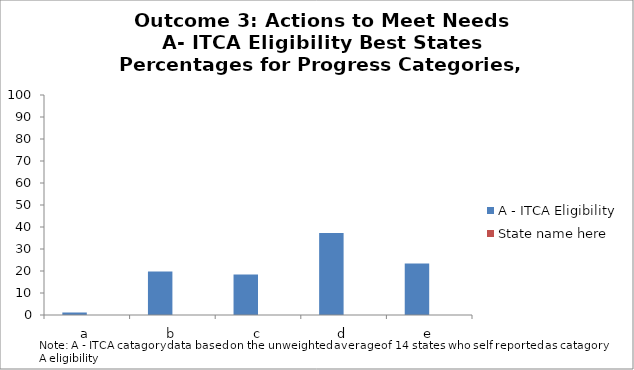
| Category | A - ITCA Eligibility | State name here |
|---|---|---|
| a | 1.14 |  |
| b | 19.8 |  |
| c | 18.4 |  |
| d | 37.3 |  |
| e | 23.4 |  |